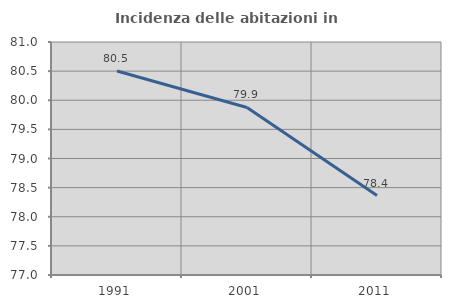
| Category | Incidenza delle abitazioni in proprietà  |
|---|---|
| 1991.0 | 80.503 |
| 2001.0 | 79.877 |
| 2011.0 | 78.363 |